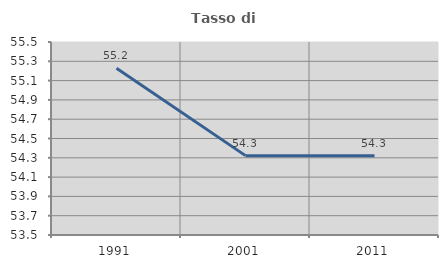
| Category | Tasso di occupazione   |
|---|---|
| 1991.0 | 55.228 |
| 2001.0 | 54.323 |
| 2011.0 | 54.32 |